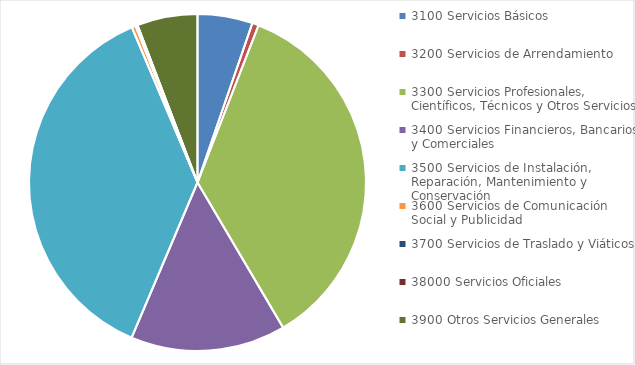
| Category |  Asignado  |
|---|---|
| 3100 Servicios Básicos | 137088310.29 |
| 3200 Servicios de Arrendamiento | 15995830.24 |
| 3300 Servicios Profesionales, Científicos, Técnicos y Otros Servicios | 925360787.57 |
| 3400 Servicios Financieros, Bancarios y Comerciales | 386396809.79 |
| 3500 Servicios de Instalación, Reparación, Mantenimiento y Conservación | 967287261.29 |
| 3600 Servicios de Comunicación Social y Publicidad | 9836852 |
| 3700 Servicios de Traslado y Viáticos | 4632003.05 |
| 38000 Servicios Oficiales | 465750 |
| 3900 Otros Servicios Generales | 150577940.56 |